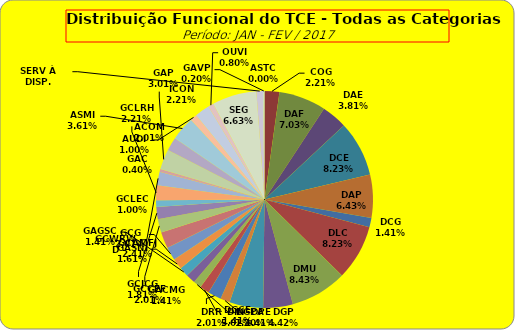
| Category | ASTC |
|---|---|
| ASTC | 0 |
| COG | 11 |
| DAF | 35 |
| DAE | 19 |
| DCE | 41 |
| DAP | 32 |
| DCG | 7 |
| DLC | 41 |
| DMU | 42 |
| DGP | 22 |
| DIN | 25 |
| DPE | 7 |
| DRR | 10 |
| DGCE | 7 |
| DGPA | 6 |
| GACMG | 7 |
| GAGSC | 7 |
| GASNI | 8 |
| GCG | 10 |
| GCAMFJ | 12 |
| GCCFF | 10 |
| GCJCG | 9 |
| GCLEC | 5 |
| GCLRH | 11 |
| GCWRWD | 10 |
| GAC | 2 |
| GAP | 15 |
| ACOM | 10 |
| ASMI | 18 |
| AUDI | 5 |
| ICON | 11 |
| OUVI | 4 |
| SEG | 33 |
| SERV À DISP. | 5 |
| GAVP | 1 |